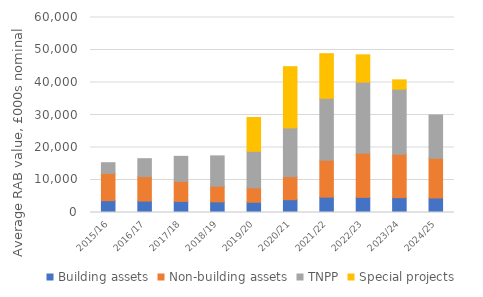
| Category | Building assets | Non-building assets | TNPP | Special projects |
|---|---|---|---|---|
| 2015/16 | 3646.723 | 8390.822 | 3287.382 | 0 |
| 2016/17 | 3516.222 | 7548.266 | 5492.024 | 0 |
| 2017/18 | 3401.469 | 6151.32 | 7729.517 | 0 |
| 2018/19 | 3276.999 | 4818.17 | 9323.852 | 0 |
| 2019/20 | 3148.47 | 4445.124 | 11238.958 | 10395.256 |
| 2020/21 | 3944.251 | 7095.944 | 14981.43 | 18848.147 |
| 2021/22 | 4718.617 | 11380.934 | 19035.403 | 13732.222 |
| 2022/23 | 4640.992 | 13602.068 | 21871.104 | 8404.12 |
| 2023/24 | 4555.84 | 13401.289 | 19993.471 | 2857.401 |
| 2024/25 | 4462.825 | 12219.916 | 13324.903 | 0 |